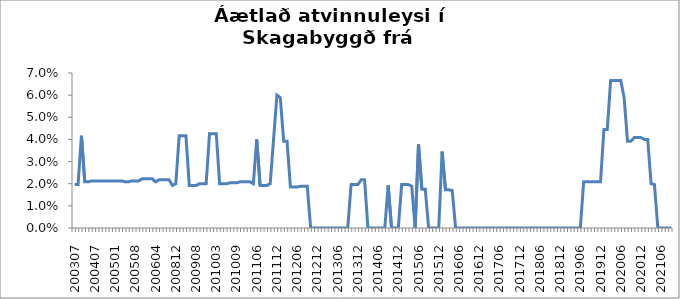
| Category | Series 0 |
|---|---|
| 200307 | 0.02 |
| 200309 | 0.02 |
| 200310 | 0.042 |
| 200311 | 0.021 |
| 200312 | 0.021 |
| 200402 | 0.021 |
| 200407 | 0.021 |
| 200408 | 0.021 |
| 200409 | 0.021 |
| 200410 | 0.021 |
| 200411 | 0.021 |
| 200412 | 0.021 |
| 200501 | 0.021 |
| 200502 | 0.021 |
| 200503 | 0.021 |
| 200505 | 0.021 |
| 200506 | 0.021 |
| 200507 | 0.021 |
| 200508 | 0.021 |
| 200509 | 0.021 |
| 200510 | 0.022 |
| 200511 | 0.022 |
| 200602 | 0.022 |
| 200603 | 0.022 |
| 200604 | 0.021 |
| 200610 | 0.022 |
| 200611 | 0.022 |
| 200701 | 0.022 |
| 200702 | 0.022 |
| 200703 | 0.019 |
| 200812 | 0.02 |
| 200901 | 0.042 |
| 200902 | 0.042 |
| 200903 | 0.042 |
| 200904 | 0.019 |
| 200907 | 0.019 |
| 200908 | 0.019 |
| 200910 | 0.02 |
| 200911 | 0.02 |
| 200912 | 0.02 |
| 201001 | 0.043 |
| 201002 | 0.043 |
| 201003 | 0.043 |
| 201004 | 0.02 |
| 201005 | 0.02 |
| 201006 | 0.02 |
| 201007 | 0.02 |
| 201008 | 0.02 |
| 201009 | 0.02 |
| 201010 | 0.021 |
| 201011 | 0.021 |
| 201012 | 0.021 |
| 201101 | 0.021 |
| 201105 | 0.02 |
| 201106 | 0.04 |
| 201107 | 0.019 |
| 201108 | 0.019 |
| 201109 | 0.019 |
| 201110 | 0.02 |
| 201111 | 0.04 |
| 201112 | 0.06 |
| 201201 | 0.059 |
| 201202 | 0.039 |
| 201203 | 0.039 |
| 201204 | 0.019 |
| 201205 | 0.019 |
| 201206 | 0.019 |
| 201207 | 0.019 |
| 201208 | 0.019 |
| 201209 | 0.019 |
| 201210 | 0 |
| 201211 | 0 |
| 201212 | 0 |
| 201301 | 0 |
| 201302 | 0 |
| 201303 | 0 |
| 201304 | 0 |
| 201305 | 0 |
| 201306 | 0 |
| 201307 | 0 |
| 201308 | 0 |
| 201309 | 0 |
| 201310 | 0.02 |
| 201311 | 0.02 |
| 201312 | 0.02 |
| 201401 | 0.022 |
| 201402 | 0.022 |
| 201403 | 0 |
| 201404 | 0 |
| 201405 | 0 |
| 201406 | 0 |
| 201407 | 0 |
| 201408 | 0 |
| 201409 | 0.019 |
| 201410 | 0 |
| 201411 | 0 |
| 201412 | 0 |
| 201501 | 0.02 |
| 201502 | 0.02 |
| 201503 | 0.02 |
| 201504 | 0.019 |
| 201505 | 0 |
| 201506 | 0.038 |
| 201507 | 0.018 |
| 201508 | 0.018 |
| 201509 | 0 |
| 201510 | 0 |
| 201511 | 0 |
| 201512 | 0 |
| 201601 | 0.034 |
| 201602 | 0.017 |
| 201603 | 0.017 |
| 201604 | 0.017 |
| 201605 | 0 |
| 201606 | 0 |
| 201607 | 0 |
| 201608 | 0 |
| 201609 | 0 |
| 201610 | 0 |
| 201611 | 0 |
| 201612 | 0 |
| 201701 | 0 |
| 201702 | 0 |
| 201703 | 0 |
| 201704 | 0 |
| 201705 | 0 |
| 201706 | 0 |
| 201707 | 0 |
| 201708 | 0 |
| 201709 | 0 |
| 201710 | 0 |
| 201711 | 0 |
| 201712 | 0 |
| 201801 | 0 |
| 201802 | 0 |
| 201803 | 0 |
| 201804 | 0 |
| 201805 | 0 |
| 201806 | 0 |
| 201807 | 0 |
| 201808 | 0 |
| 201809 | 0 |
| 201810 | 0 |
| 201811 | 0 |
| 201812 | 0 |
| 201901 | 0 |
| 201902 | 0 |
| 201903 | 0 |
| 201904 | 0 |
| 201905 | 0 |
| 201906 | 0 |
| 201907 | 0.021 |
| 201908 | 0.021 |
| 201909 | 0.021 |
| 201910 | 0.021 |
| 201911 | 0.021 |
| 201912 | 0.021 |
| 202001 | 0.044 |
| 202002 | 0.044 |
| 202003 | 0.067 |
| 202004 | 0.067 |
| 202005 | 0.067 |
| 202006 | 0.067 |
| 202007 | 0.059 |
| 202008 | 0.039 |
| 202009 | 0.039 |
| 202010 | 0.041 |
| 202011 | 0.041 |
| 202012 | 0.041 |
| 202101 | 0.04 |
| 202102 | 0.04 |
| 202103 | 0.02 |
| 202104 | 0.02 |
| 202105 | 0 |
| 202106 | 0 |
| 202107 | 0 |
| 202108 | 0 |
| 202109 | 0 |